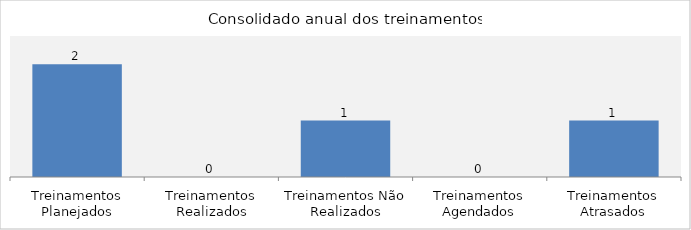
| Category | Total |
|---|---|
| Treinamentos Planejados | 2 |
| Treinamentos Realizados | 0 |
| Treinamentos Não Realizados | 1 |
| Treinamentos Agendados | 0 |
| Treinamentos Atrasados | 1 |